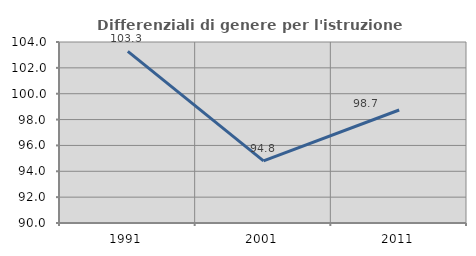
| Category | Differenziali di genere per l'istruzione superiore |
|---|---|
| 1991.0 | 103.269 |
| 2001.0 | 94.805 |
| 2011.0 | 98.739 |